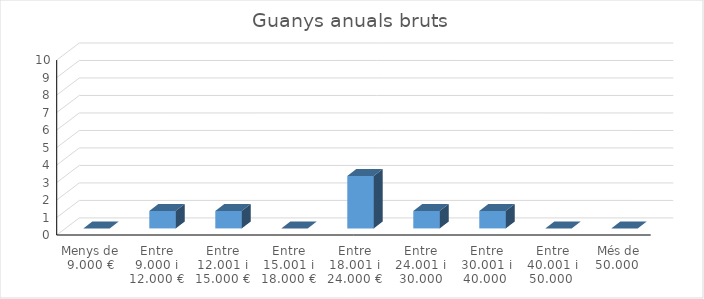
| Category | Series 0 |
|---|---|
| Menys de 9.000 € | 0 |
| Entre 9.000 i 12.000 € | 1 |
| Entre 12.001 i 15.000 € | 1 |
| Entre 15.001 i 18.000 € | 0 |
| Entre 18.001 i 24.000 € | 3 |
| Entre 24.001 i 30.000 | 1 |
| Entre 30.001 i 40.000  | 1 |
| Entre 40.001 i 50.000  | 0 |
| Més de 50.000  | 0 |